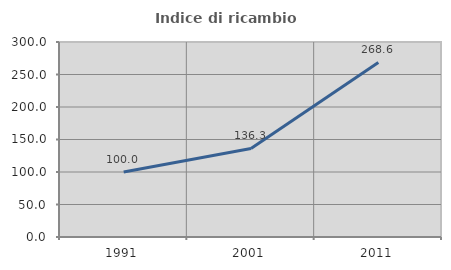
| Category | Indice di ricambio occupazionale  |
|---|---|
| 1991.0 | 100 |
| 2001.0 | 136.264 |
| 2011.0 | 268.627 |